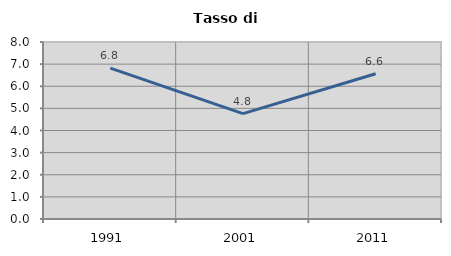
| Category | Tasso di disoccupazione   |
|---|---|
| 1991.0 | 6.818 |
| 2001.0 | 4.762 |
| 2011.0 | 6.564 |